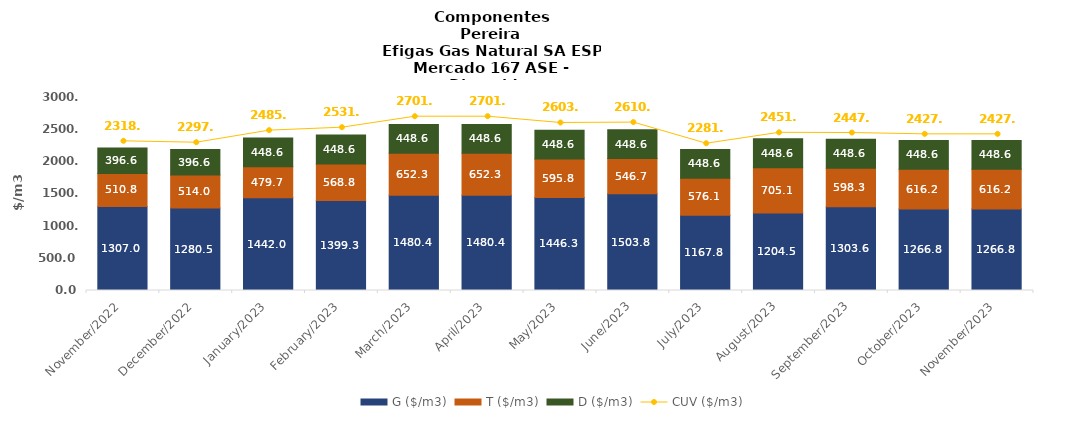
| Category | G ($/m3) | T ($/m3) | D ($/m3) |
|---|---|---|---|
| 2022-11-01 | 1306.98 | 510.84 | 396.6 |
| 2022-12-01 | 1280.49 | 513.98 | 396.6 |
| 2023-01-01 | 1442 | 479.72 | 448.63 |
| 2023-02-01 | 1399.342 | 568.805 | 448.635 |
| 2023-03-01 | 1480.39 | 652.25 | 448.635 |
| 2023-04-01 | 1480.39 | 652.25 | 448.635 |
| 2023-05-01 | 1446.347 | 595.782 | 448.635 |
| 2023-06-01 | 1503.75 | 546.731 | 448.635 |
| 2023-07-01 | 1167.85 | 576.067 | 448.635 |
| 2023-08-01 | 1204.533 | 705.123 | 448.635 |
| 2023-09-01 | 1303.571 | 598.275 | 448.635 |
| 2023-10-01 | 1266.828 | 616.197 | 448.635 |
| 2023-11-01 | 1266.828 | 616.197 | 448.635 |